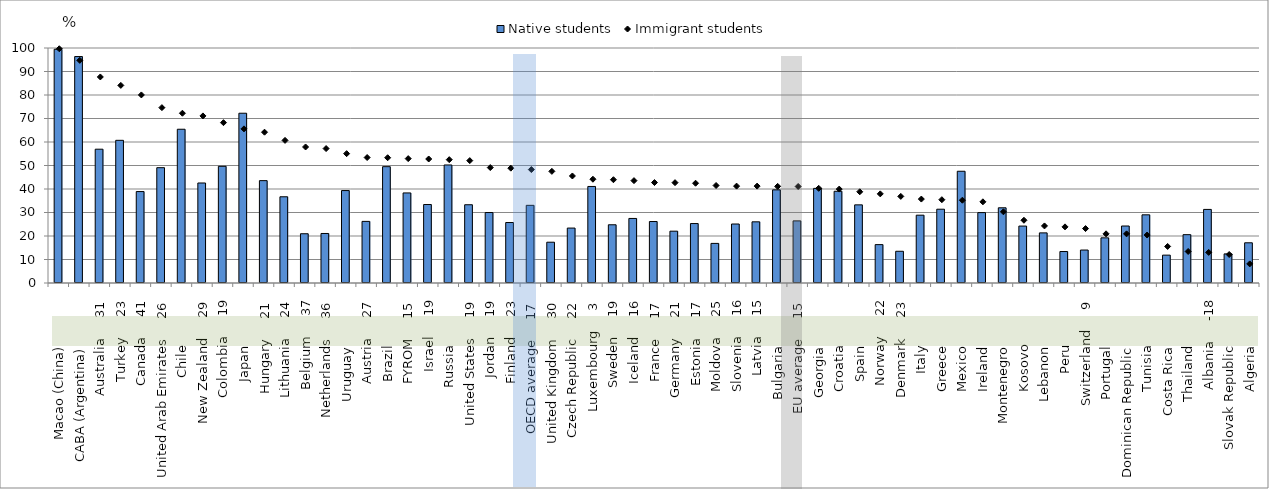
| Category | Native students |
|---|---|
| Macao (China)            | 99.467 |
| CABA (Argentina)            | 96.362 |
| Australia     31 | 56.939 |
| Turkey     23 | 60.716 |
| Canada     41 | 38.909 |
| United Arab Emirates     26 | 49.072 |
| Chile            | 65.432 |
| New Zealand     29 | 42.556 |
| Colombia     19 | 49.661 |
| Japan            | 72.242 |
| Hungary     21 | 43.559 |
| Lithuania     24 | 36.693 |
| Belgium     37 | 20.964 |
| Netherlands     36 | 21.075 |
| Uruguay            | 39.329 |
| Austria     27 | 26.222 |
| Brazil            | 49.504 |
| FYROM     15 | 38.326 |
| Israel     19 | 33.394 |
| Russia            | 50.228 |
| United States     19 | 33.3 |
| Jordan     19 | 29.99 |
| Finland     23 | 25.737 |
| OECD average     17 | 33.051 |
| United Kingdom     30 | 17.355 |
| Czech Republic     22 | 23.374 |
| Luxembourg     3 | 41.081 |
| Sweden     19 | 24.78 |
| Iceland     16 | 27.473 |
| France     17 | 26.158 |
| Germany     21 | 22.053 |
| Estonia     17 | 25.295 |
| Moldova     25 | 16.85 |
| Slovenia     16 | 25.102 |
| Latvia     15 | 26.036 |
| Bulgaria            | 39.635 |
| EU average     15 | 26.434 |
| Georgia            | 40.267 |
| Croatia            | 39.036 |
| Spain            | 33.252 |
| Norway     22 | 16.335 |
| Denmark     23 | 13.5 |
| Italy            | 28.856 |
| Greece            | 31.4 |
| Mexico            | 47.552 |
| Ireland            | 29.958 |
| Montenegro            | 32.005 |
| Kosovo            | 24.226 |
| Lebanon            | 21.324 |
| Peru            | 13.393 |
| Switzerland     9 | 14.027 |
| Portugal            | 19.217 |
| Dominican Republic            | 24.254 |
| Tunisia            | 29.011 |
| Costa Rica            | 11.861 |
| Thailand            | 20.566 |
| Albania     -18 | 31.316 |
| Slovak Republic            | 12.39 |
| Algeria            | 17.112 |